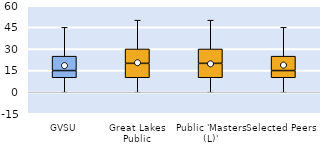
| Category | 25th | 50th | 75th |
|---|---|---|---|
| GVSU | 10 | 5 | 10 |
| Great Lakes Public | 10 | 10 | 10 |
| Public 'Masters (L)' | 10 | 10 | 10 |
| Selected Peers | 10 | 5 | 10 |